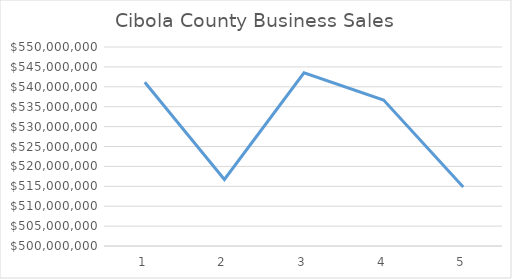
| Category | Series 0 |
|---|---|
| 0 | 541151591.077 |
| 1 | 516712209.35 |
| 2 | 543507544.603 |
| 3 | 536676019.71 |
| 4 | 514839957.85 |